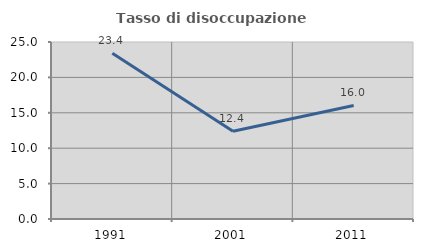
| Category | Tasso di disoccupazione giovanile  |
|---|---|
| 1991.0 | 23.415 |
| 2001.0 | 12.389 |
| 2011.0 | 16.038 |